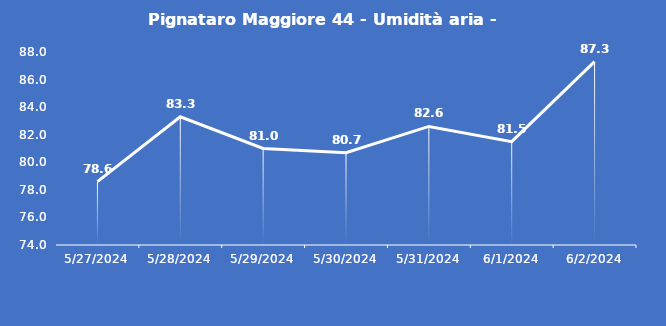
| Category | Pignataro Maggiore 44 - Umidità aria - Grezzo (%) |
|---|---|
| 5/27/24 | 78.6 |
| 5/28/24 | 83.3 |
| 5/29/24 | 81 |
| 5/30/24 | 80.7 |
| 5/31/24 | 82.6 |
| 6/1/24 | 81.5 |
| 6/2/24 | 87.3 |